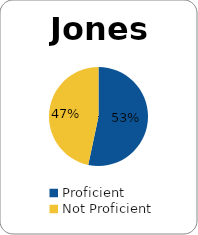
| Category | Series 0 |
|---|---|
| Proficient | 0.533 |
| Not Proficient | 0.467 |